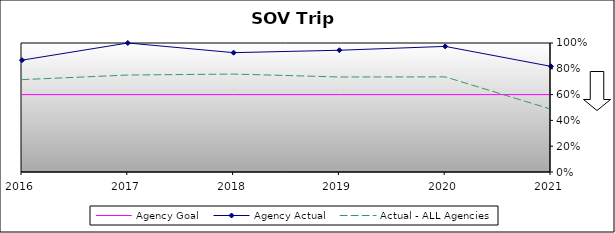
| Category | Agency Goal | Agency Actual | Actual - ALL Agencies |
|---|---|---|---|
| 2016.0 | 0.6 | 0.867 | 0.716 |
| 2017.0 | 0.6 | 1 | 0.752 |
| 2018.0 | 0.6 | 0.925 | 0.759 |
| 2019.0 | 0.6 | 0.944 | 0.736 |
| 2020.0 | 0.6 | 0.974 | 0.737 |
| 2021.0 | 0.6 | 0.819 | 0.487 |